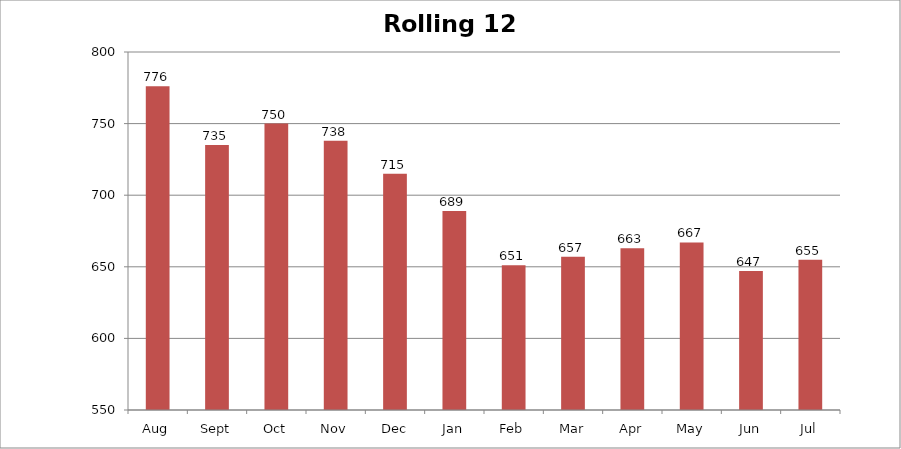
| Category | Rolling 12 Month |
|---|---|
| Aug | 776 |
| Sept | 735 |
| Oct | 750 |
| Nov | 738 |
| Dec | 715 |
| Jan | 689 |
| Feb | 651 |
| Mar | 657 |
| Apr | 663 |
| May | 667 |
| Jun | 647 |
| Jul | 655 |